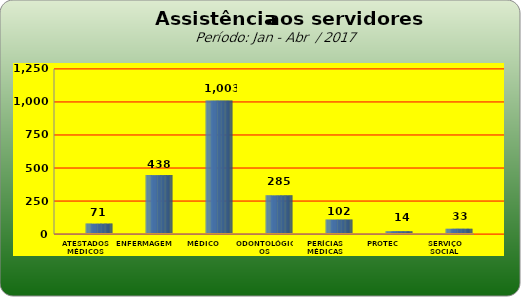
| Category | Series 0 |
|---|---|
| ATESTADOS MÉDICOS | 71 |
| ENFERMAGEM | 438 |
| MÉDICO | 1003 |
| ODONTOLÓGICOS | 285 |
| PERÍCIAS MÉDICAS | 102 |
| PROTEC | 14 |
| SERVIÇO SOCIAL | 33 |